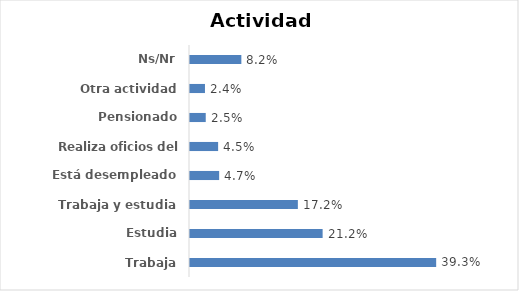
| Category | Series 0 |
|---|---|
| Trabaja | 0.393 |
| Estudia | 0.212 |
| Trabaja y estudia | 0.172 |
| Está desempleado | 0.047 |
| Realiza oficios del hogar | 0.045 |
| Pensionado | 0.025 |
| Otra actividad | 0.024 |
| Ns/Nr | 0.082 |